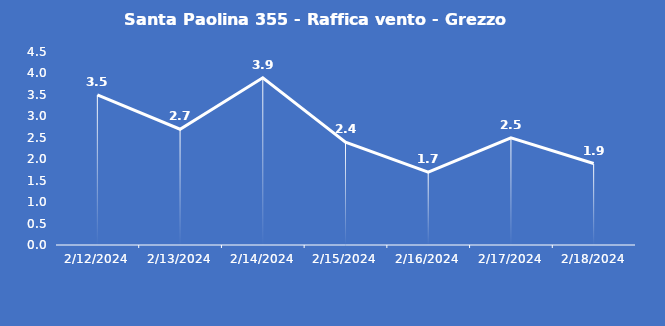
| Category | Santa Paolina 355 - Raffica vento - Grezzo (m/s) |
|---|---|
| 2/12/24 | 3.5 |
| 2/13/24 | 2.7 |
| 2/14/24 | 3.9 |
| 2/15/24 | 2.4 |
| 2/16/24 | 1.7 |
| 2/17/24 | 2.5 |
| 2/18/24 | 1.9 |